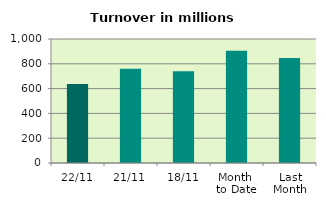
| Category | Series 0 |
|---|---|
| 22/11 | 636.191 |
| 21/11 | 760.184 |
| 18/11 | 739.653 |
| Month 
to Date | 905.152 |
| Last
Month | 847.422 |